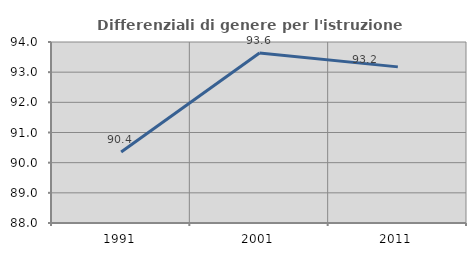
| Category | Differenziali di genere per l'istruzione superiore |
|---|---|
| 1991.0 | 90.355 |
| 2001.0 | 93.638 |
| 2011.0 | 93.176 |